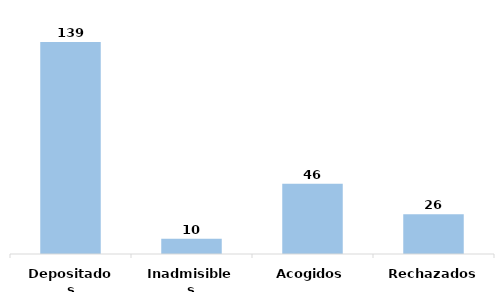
| Category | Series 0 |
|---|---|
| Depositados | 139 |
| Inadmisibles | 10 |
| Acogidos | 46 |
| Rechazados | 26 |